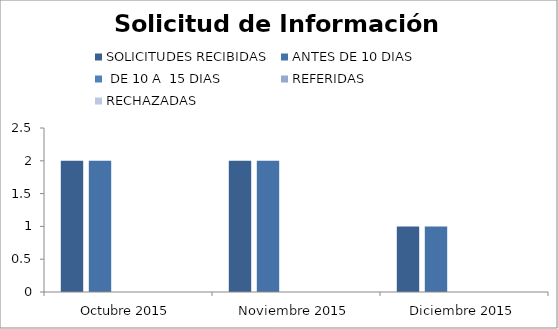
| Category | SOLICITUDES RECIBIDAS | ANTES DE 10 DIAS |  DE 10 A  15 DIAS  | REFERIDAS | RECHAZADAS |
|---|---|---|---|---|---|
| Octubre 2015 | 2 | 2 | 0 | 0 | 0 |
| Noviembre 2015 | 2 | 2 | 0 | 0 | 0 |
| Diciembre 2015 | 1 | 1 | 0 | 0 | 0 |